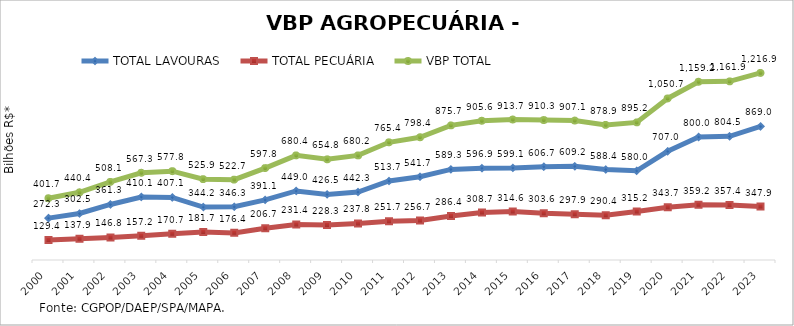
| Category | TOTAL LAVOURAS | TOTAL PECUÁRIA | VBP TOTAL |
|---|---|---|---|
| 2000 | 272.299 | 129.417 | 401.716 |
| 2001 | 302.474 | 137.902 | 440.376 |
| 2002 | 361.316 | 146.788 | 508.104 |
| 2003 | 410.091 | 157.23 | 567.321 |
| 2004 | 407.088 | 170.679 | 577.767 |
| 2005 | 344.175 | 181.741 | 525.915 |
| 2006 | 346.277 | 176.427 | 522.705 |
| 2007 | 391.057 | 206.735 | 597.792 |
| 2008 | 449.03 | 231.4 | 680.43 |
| 2009 | 426.519 | 228.325 | 654.845 |
| 2010 | 442.348 | 237.844 | 680.191 |
| 2011 | 513.732 | 251.716 | 765.448 |
| 2012 | 541.668 | 256.735 | 798.403 |
| 2013 | 589.339 | 286.404 | 875.743 |
| 2014 | 596.921 | 308.71 | 905.631 |
| 2015 | 599.087 | 314.641 | 913.728 |
| 2016 | 606.662 | 303.596 | 910.258 |
| 2017 | 609.181 | 297.909 | 907.09 |
| 2018 | 588.435 | 290.437 | 878.872 |
| 2019 | 579.973 | 315.179 | 895.152 |
| 2020 | 707 | 343.657 | 1050.657 |
| 2021 | 799.988 | 359.248 | 1159.236 |
| 2022 | 804.489 | 357.396 | 1161.885 |
| 2023 | 868.961 | 347.944 | 1216.906 |